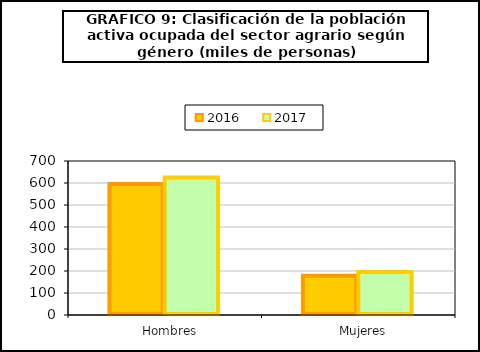
| Category | 2016 | 2017 |
|---|---|---|
|    Hombres | 595.9 | 624.7 |
|    Mujeres | 178.7 | 194.9 |